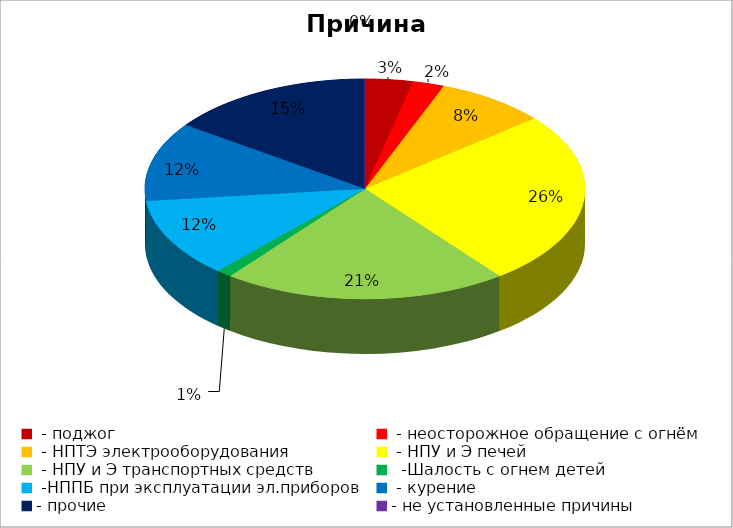
| Category | Причина пожара |
|---|---|
|  - поджог | 3 |
|  - неосторожное обращение с огнём | 2 |
|  - НПТЭ электрооборудования | 7 |
|  - НПУ и Э печей | 22 |
|  - НПУ и Э транспортных средств | 18 |
|   -Шалость с огнем детей | 1 |
|  -НППБ при эксплуатации эл.приборов | 10 |
|  - курение | 10 |
| - прочие | 13 |
| - не установленные причины | 0 |